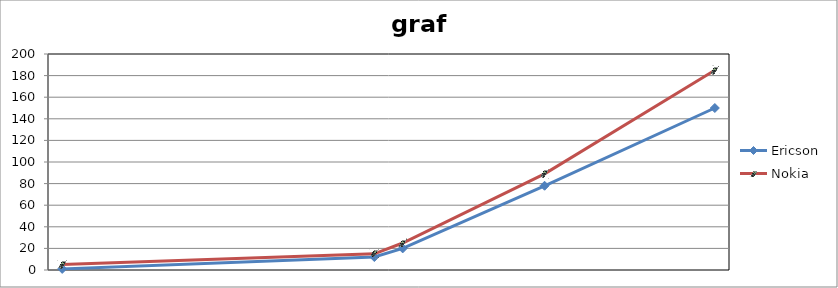
| Category | Ericson | Nokia |
|---|---|---|
| 1999-01-01 | 1000 | 5000 |
| 1999-12-01 | 12000 | 15000 |
| 2000-01-01 | 20000 | 25000 |
| 2000-06-01 | 78000 | 89000 |
| 2000-12-01 | 150000 | 185000 |